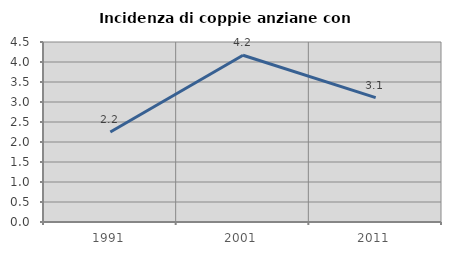
| Category | Incidenza di coppie anziane con figli |
|---|---|
| 1991.0 | 2.248 |
| 2001.0 | 4.169 |
| 2011.0 | 3.109 |